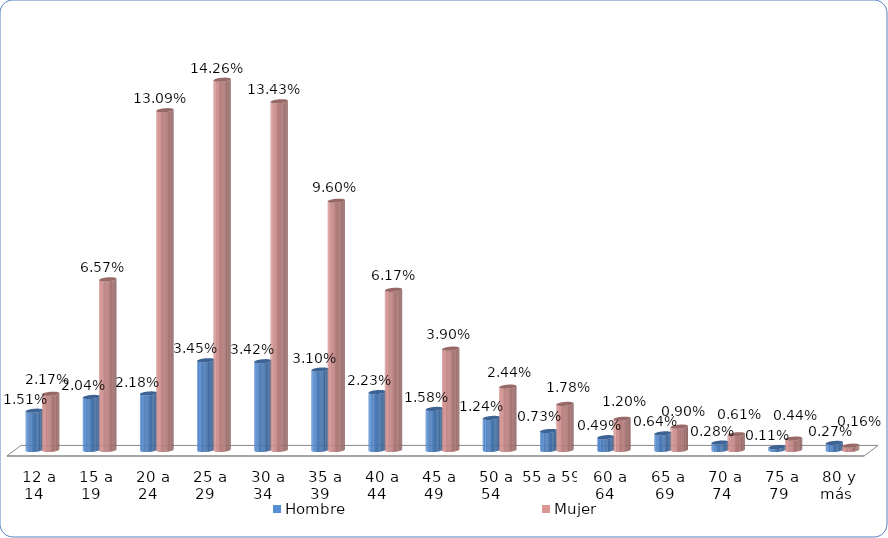
| Category | Hombre | Mujer |
|---|---|---|
|  12 a 14  | 0.015 | 0.022 |
|  15 a 19  | 0.02 | 0.066 |
|  20 a 24  | 0.022 | 0.131 |
|  25 a 29  | 0.035 | 0.143 |
|  30 a 34  | 0.034 | 0.134 |
|  35 a 39  | 0.031 | 0.096 |
|  40 a 44  | 0.022 | 0.062 |
|  45 a 49  | 0.016 | 0.039 |
|  50 a 54  | 0.012 | 0.024 |
| 55 a 59  | 0.007 | 0.018 |
|  60 a 64  | 0.005 | 0.012 |
|  65 a 69 | 0.006 | 0.009 |
|  70 a 74 | 0.003 | 0.006 |
|  75 a 79 | 0.001 | 0.004 |
|  80 y más | 0.003 | 0.002 |